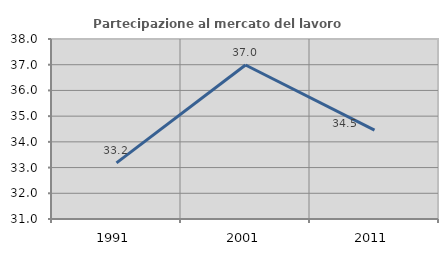
| Category | Partecipazione al mercato del lavoro  femminile |
|---|---|
| 1991.0 | 33.181 |
| 2001.0 | 36.989 |
| 2011.0 | 34.459 |